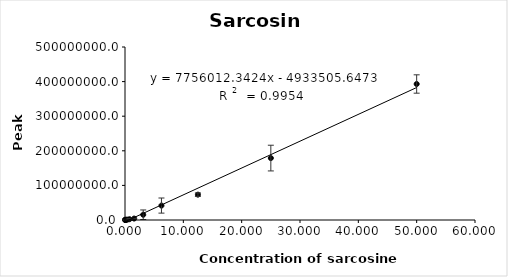
| Category | Series 0 |
|---|---|
| 0.012 | 527361 |
| 0.024 | 219925.667 |
| 0.049 | 247052.333 |
| 0.098 | 204195.667 |
| 0.195 | 473032.167 |
| 0.390625 | 1100698.167 |
| 0.78125 | 2245030.167 |
| 1.5625 | 4115502 |
| 3.125 | 15225592.167 |
| 6.25 | 41714321.833 |
| 12.5 | 73259416.667 |
| 25.0 | 178979314.667 |
| 50.0 | 393056298.667 |